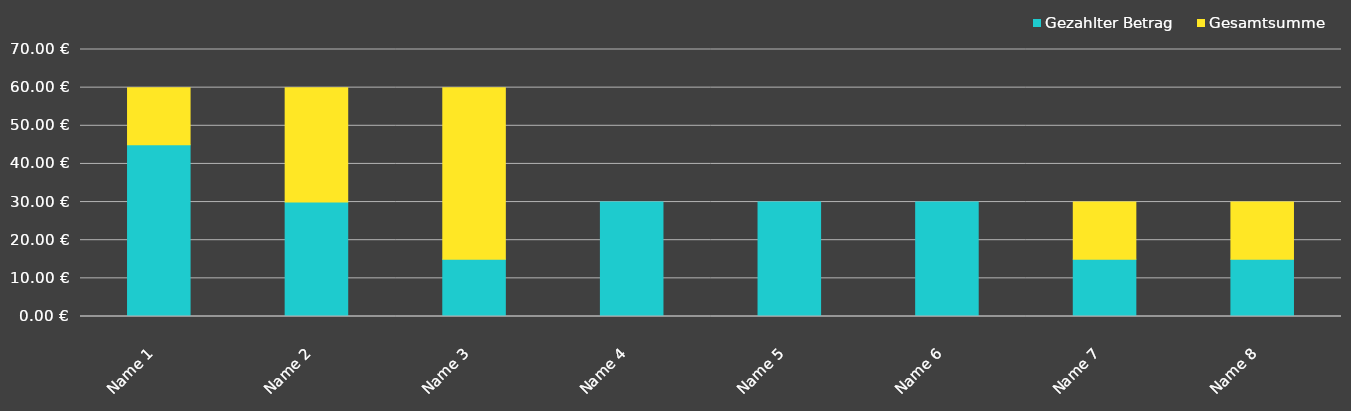
| Category | Gezahlter Betrag | Gesamtsumme |
|---|---|---|
| Name 1 | 45 | 15 |
| Name 2 | 30 | 30 |
| Name 3 | 15 | 45 |
| Name 4 | 30 | 0 |
| Name 5 | 30 | 0 |
| Name 6 | 30 | 0 |
| Name 7 | 15 | 15 |
| Name 8 | 15 | 15 |